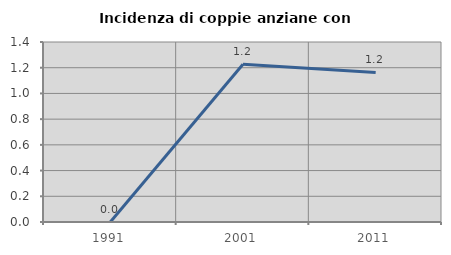
| Category | Incidenza di coppie anziane con figli |
|---|---|
| 1991.0 | 0 |
| 2001.0 | 1.227 |
| 2011.0 | 1.163 |